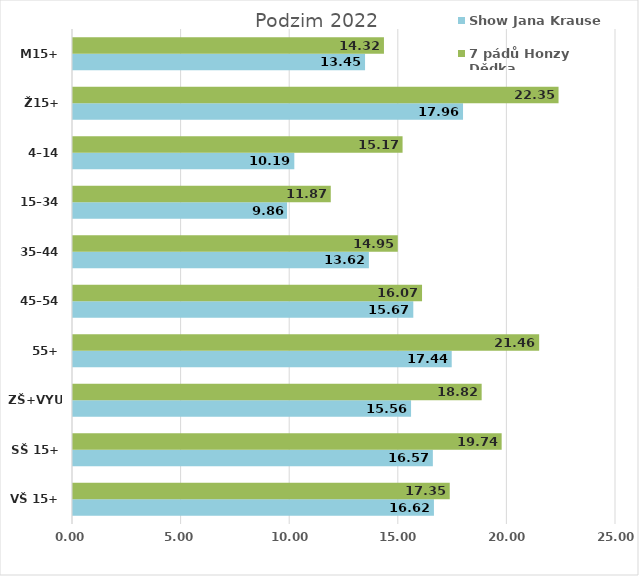
| Category | Show Jana Krause | 7 pádů Honzy Dědka |
|---|---|---|
| VŠ 15+ | 16.618 | 17.346 |
| SŠ 15+ | 16.568 | 19.736 |
| ZŠ+VYUČ | 15.564 | 18.815 |
| 55+ | 17.436 | 21.462 |
| 45–54 | 15.668 | 16.07 |
| 35–44 | 13.623 | 14.953 |
| 15–34 | 9.857 | 11.868 |
| 4–14 | 10.189 | 15.174 |
| Ž15+ | 17.957 | 22.355 |
| M15+ | 13.446 | 14.316 |